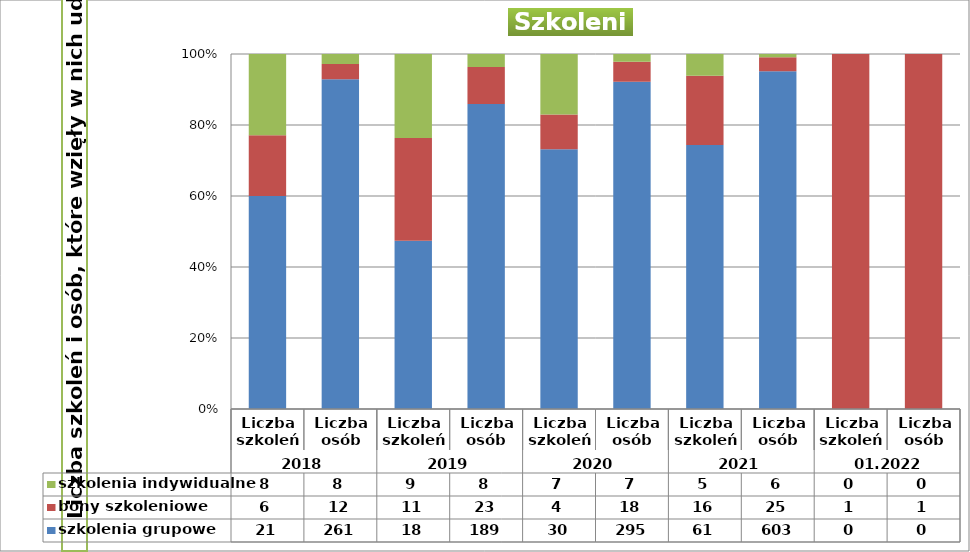
| Category | szkolenia grupowe | bony szkoleniowe | szkolenia indywidualne |
|---|---|---|---|
| 0 | 21 | 6 | 8 |
| 1 | 261 | 12 | 8 |
| 2 | 18 | 11 | 9 |
| 3 | 189 | 23 | 8 |
| 4 | 30 | 4 | 7 |
| 5 | 295 | 18 | 7 |
| 6 | 61 | 16 | 5 |
| 7 | 603 | 25 | 6 |
| 8 | 0 | 1 | 0 |
| 9 | 0 | 1 | 0 |